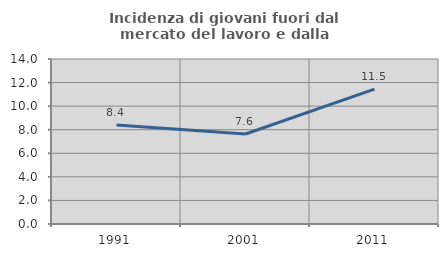
| Category | Incidenza di giovani fuori dal mercato del lavoro e dalla formazione  |
|---|---|
| 1991.0 | 8.392 |
| 2001.0 | 7.634 |
| 2011.0 | 11.45 |